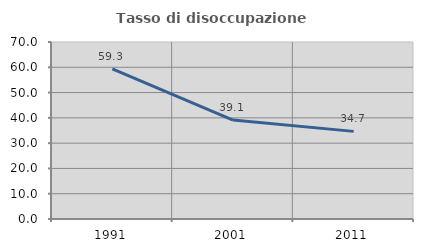
| Category | Tasso di disoccupazione giovanile  |
|---|---|
| 1991.0 | 59.343 |
| 2001.0 | 39.146 |
| 2011.0 | 34.653 |